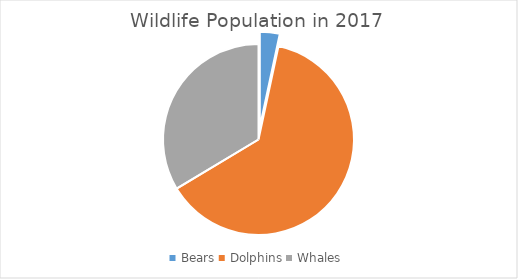
| Category | 2017 |
|---|---|
| Bears | 8 |
| Dolphins | 150 |
| Whales | 80 |